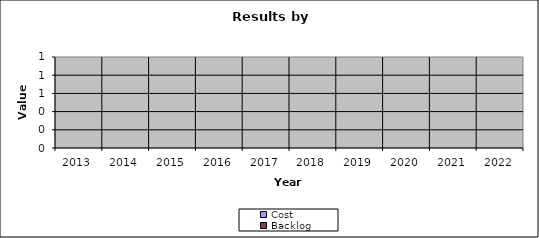
| Category | Cost | Backlog |
|---|---|---|
| 2013.0 | 0 | 0 |
| 2014.0 | 0 | 0 |
| 2015.0 | 0 | 0 |
| 2016.0 | 0 | 0 |
| 2017.0 | 0 | 0 |
| 2018.0 | 0 | 0 |
| 2019.0 | 0 | 0 |
| 2020.0 | 0 | 0 |
| 2021.0 | 0 | 0 |
| 2022.0 | 0 | 0 |